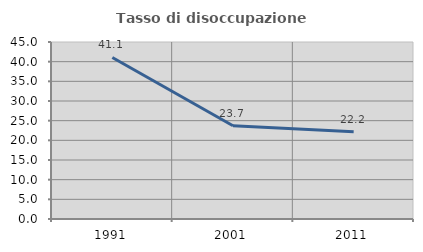
| Category | Tasso di disoccupazione giovanile  |
|---|---|
| 1991.0 | 41.075 |
| 2001.0 | 23.695 |
| 2011.0 | 22.179 |